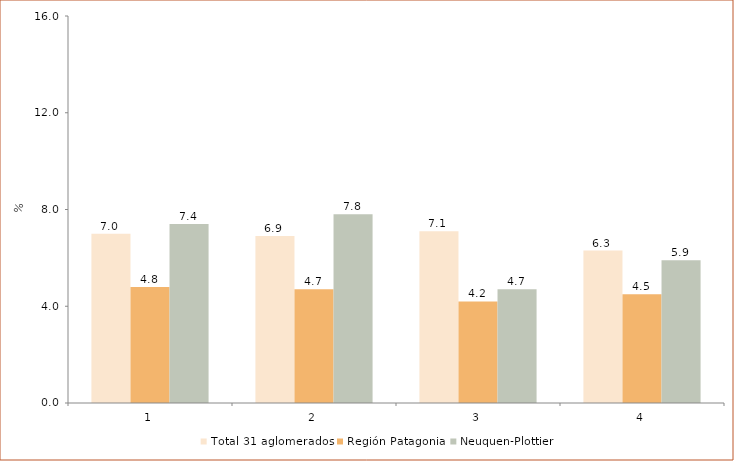
| Category | Total 31 aglomerados | Región Patagonia | Neuquen-Plottier |
|---|---|---|---|
| 0 | 7 | 4.8 | 7.4 |
| 1 | 6.9 | 4.7 | 7.8 |
| 2 | 7.1 | 4.2 | 4.7 |
| 3 | 6.3 | 4.5 | 5.9 |